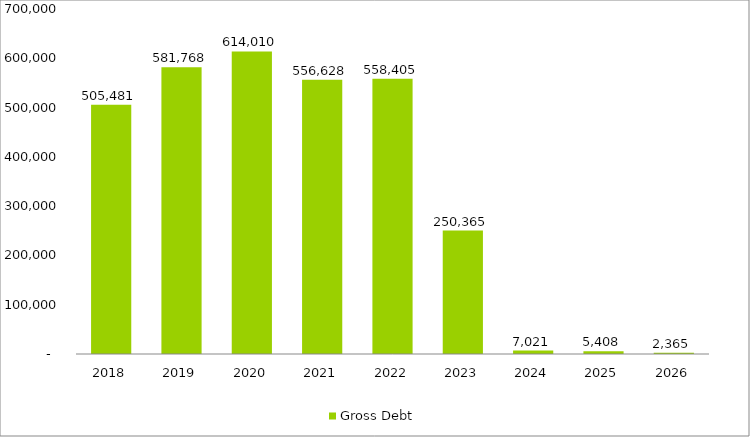
| Category | Gross Debt |
|---|---|
| 2018 | 505481.117 |
| 2019 | 581767.909 |
| 2020 | 614009.69 |
| 2021 | 556628.474 |
| 2022 | 558405.292 |
| 2023 | 250365.315 |
| 2024 | 7021.369 |
| 2025 | 5407.91 |
| 2026 | 2364.721 |